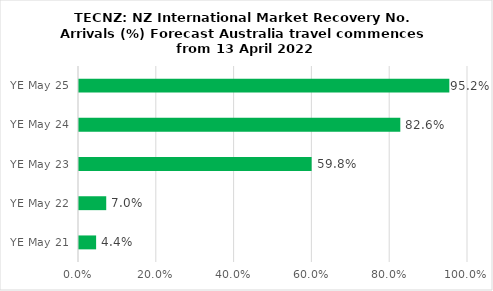
| Category | Recovery % |
|---|---|
| YE May 21 | 0.044 |
| YE May 22 | 0.07 |
| YE May 23 | 0.598 |
| YE May 24 | 0.826 |
| YE May 25 | 0.952 |